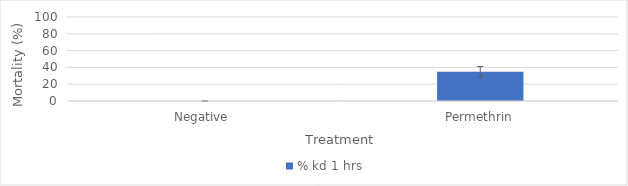
| Category | % kd 1 hrs |
|---|---|
| Negative  | 0 |
| Permethrin | 34.783 |